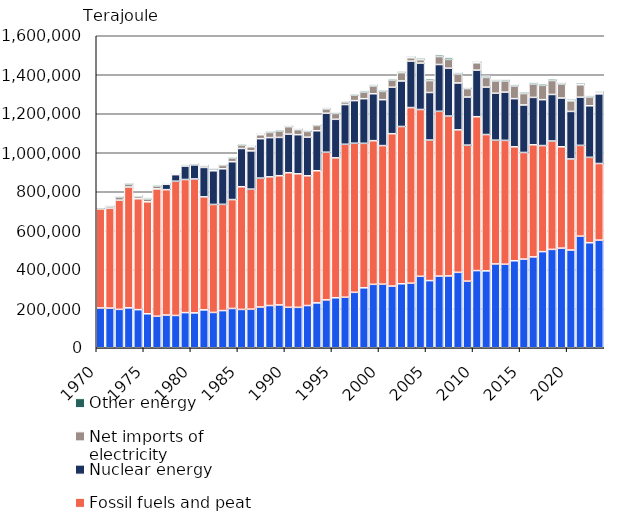
| Category | Renewable energy | Fossil fuels and peat | Nuclear energy | Net imports of electricity | Other energy |
|---|---|---|---|---|---|
| 1970 | 204034 | 508504 | 0 | 1901 | 6019 |
| 1971 | 203391 | 511718 | 0 | 9324 | 5332 |
| 1972 | 196893 | 559888 | 0 | 15188 | 6235 |
| 1973 | 204727 | 619154 | 0 | 15548 | 6710 |
| 1974 | 195495 | 568746 | 0 | 11304 | 6376 |
| 1975 | 174262 | 574160 | 0 | 14353 | 7009 |
| 1976 | 161759 | 652963 | 0 | 14454 | 6905 |
| 1977 | 167731 | 643076 | 27382 | 3208 | 5018 |
| 1978 | 165642 | 688482 | 33589 | 4597 | 3762 |
| 1979 | 180305 | 682582 | 69382 | 2336 | 4806 |
| 1980 | 178903 | 686739 | 72273 | 4360 | 4590 |
| 1981 | 194307 | 579548 | 150927 | 8078 | 5724 |
| 1982 | 181119 | 553807 | 172647 | 8330 | 6156 |
| 1983 | 190664 | 544813 | 182367 | 17201 | 6354 |
| 1984 | 201454 | 558455 | 194171 | 18774 | 6646 |
| 1985 | 196619 | 629150 | 196145 | 17017 | 6908 |
| 1986 | 197924 | 615426 | 196342 | 20905 | 6811 |
| 1987 | 208971 | 661019 | 202189 | 20142 | 6779 |
| 1988 | 216562 | 659887 | 201240 | 26586 | 7196 |
| 1989 | 219571 | 662704 | 196473 | 31925 | 7398 |
| 1990 | 207422 | 690098 | 197760 | 38671 | 7405 |
| 1991 | 207239 | 684720 | 200804 | 25862 | 6091 |
| 1992 | 216629 | 665041 | 198218 | 29632 | 6872 |
| 1993 | 230190 | 677551 | 205091 | 27133 | 6159 |
| 1994 | 245453 | 757326 | 199942 | 21881 | 6551 |
| 1995 | 256458 | 717360 | 197760 | 30258 | 6784 |
| 1996 | 259208 | 784276 | 203771 | 13180 | 6194 |
| 1997 | 284274 | 764448 | 218738 | 27551 | 7069 |
| 1998 | 307479 | 740875 | 228829 | 33502 | 7822 |
| 1999 | 325310 | 736677 | 240655 | 40046 | 7520 |
| 2000 | 326231 | 710532 | 235364 | 42768 | 7678 |
| 2001 | 316275 | 781430 | 238406 | 35852 | 7762 |
| 2002 | 328174 | 806541 | 233398 | 42930 | 7996 |
| 2003 | 331314 | 900452 | 238145 | 17467 | 8328 |
| 2004 | 366403 | 855530 | 237970 | 17532 | 8783 |
| 2005 | 344430 | 720697 | 243887 | 61250 | 9285 |
| 2006 | 367566 | 844939 | 240040 | 41044 | 9203 |
| 2007 | 368289 | 819840 | 245468 | 45205 | 9404 |
| 2008 | 386825 | 730554 | 240542 | 45980 | 9273 |
| 2009 | 341532 | 697567 | 246555 | 43504 | 7137 |
| 2010 | 395818 | 788983 | 238789 | 37802 | 8506 |
| 2011 | 394362 | 699146 | 242897 | 49863 | 7837 |
| 2012 | 429960 | 634540 | 240685 | 62796 | 7614 |
| 2013 | 428416 | 635098 | 247347 | 56574 | 8308 |
| 2014 | 446145 | 584371 | 247047 | 64678 | 8372 |
| 2015 | 454640 | 546856 | 243556 | 58813 | 8264 |
| 2016 | 465983 | 574833 | 243056 | 68222 | 8246 |
| 2017 | 492970 | 543915 | 235352 | 73532 | 8287 |
| 2018 | 504503 | 555693 | 238700 | 71769 | 8512 |
| 2019 | 511004 | 519670 | 249981 | 72151 | 8227 |
| 2020 | 501069 | 467029 | 243864 | 54377 | 9391 |
| 2021 | 572222 | 465643 | 247047 | 63965 | 9295 |
| 2022 | 538598 | 437906 | 264458 | 45063 | 8212 |
| 2023* | 552000 | 392850 | 357129 | 6207 | 8192 |